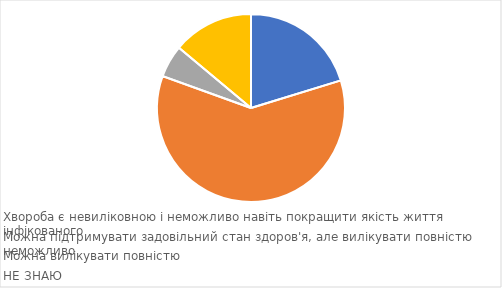
| Category | 18-24 роки |
|---|---|
| Хвороба є невиліковною і неможливо навіть покращити якість життя інфікованого | 0.203 |
| Можна підтримувати задовільний стан здоров'я, але вилікувати повністю неможливо | 0.603 |
| Можна вилікувати повністю | 0.056 |
| НЕ ЗНАЮ | 0.139 |